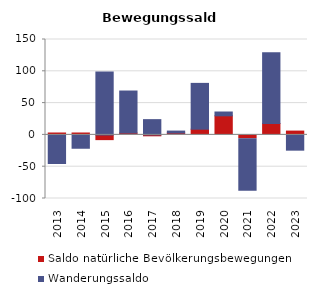
| Category | Saldo natürliche Bevölkerungsbewegungen | Wanderungssaldo |
|---|---|---|
| 2013.0 | 3 | -45 |
| 2014.0 | 3 | -21 |
| 2015.0 | -9 | 99 |
| 2016.0 | 3 | 66 |
| 2017.0 | -3 | 24 |
| 2018.0 | 3 | 3 |
| 2019.0 | 9 | 72 |
| 2020.0 | 30 | 6 |
| 2021.0 | -6 | -81 |
| 2022.0 | 18 | 111 |
| 2023.0 | 6 | -24 |